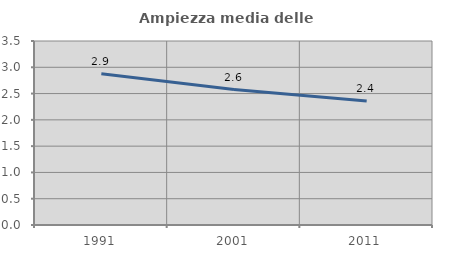
| Category | Ampiezza media delle famiglie |
|---|---|
| 1991.0 | 2.878 |
| 2001.0 | 2.576 |
| 2011.0 | 2.356 |